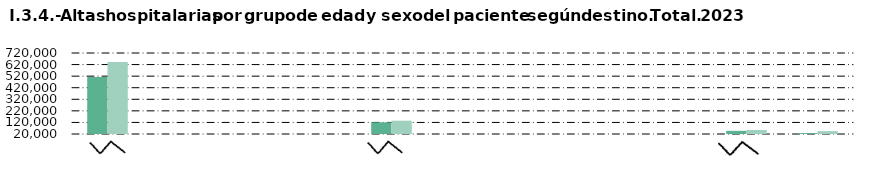
| Category | Hombre | Mujer |
|---|---|---|
| Alta médica | 513083 | 643044 |
| Alta voluntaria | 158 | 240 |
| Fallecimiento | 138 | 868 |
| Centro sociosanitario | 11 | 2 |
| Consulta hospitalaria | 121066 | 135174 |
| Urgencias | 340 | 318 |
| Cirugía ambulatoria | 242 | 355 |
| Atención primaria | 11598 | 13622 |
| Otro hospital | 1947 | 2201 |
| Continuación de tratamiento | 47400 | 54489 |
| No consta | 27876 | 44997 |